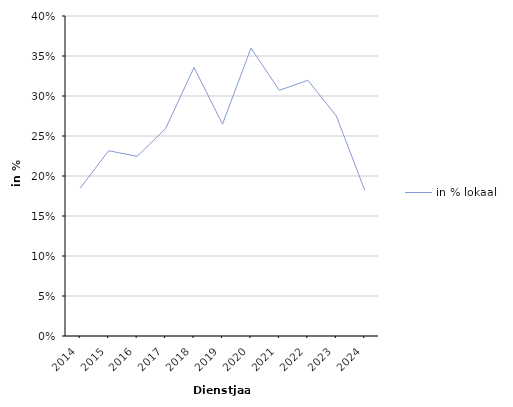
| Category | in % lokaal |
|---|---|
| 2014 | 0.185 |
| 2015 | 0.232 |
| 2016 | 0.225 |
| 2017 | 0.259 |
| 2018 | 0.336 |
| 2019 | 0.265 |
| 2020 | 0.36 |
| 2021 | 0.307 |
| 2022 | 0.32 |
| 2023 | 0.275 |
| 2024 | 0.182 |